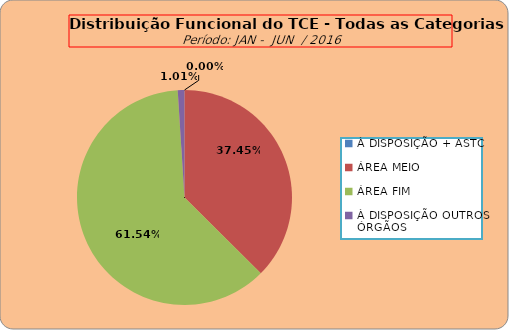
| Category | Series 0 |
|---|---|
| À DISPOSIÇÃO + ASTC | 0 |
| ÁREA MEIO | 185 |
| ÁREA FIM | 304 |
| À DISPOSIÇÃO OUTROS ÓRGÃOS | 5 |